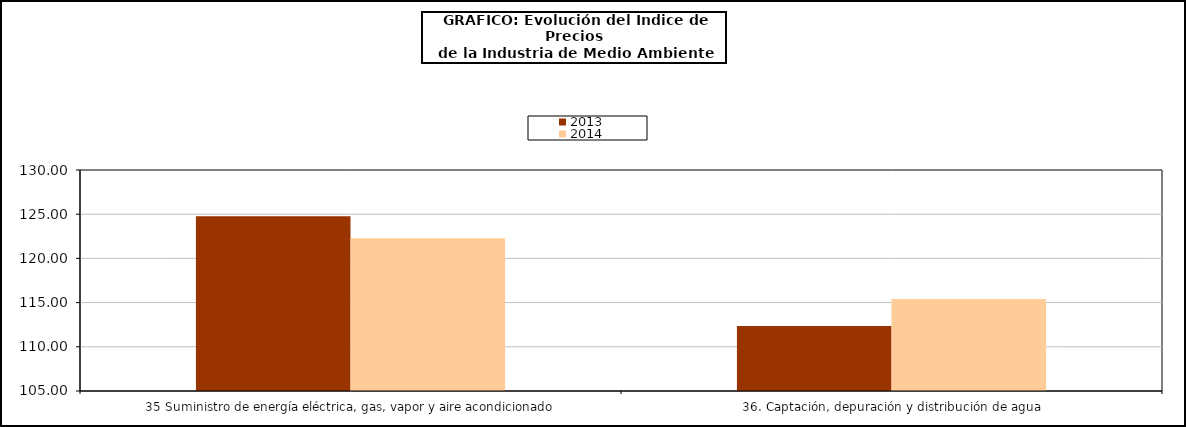
| Category | 2013 | 2014 |
|---|---|---|
| 35 Suministro de energía eléctrica, gas, vapor y aire acondicionado | 124.771 | 122.267 |
| 36. Captación, depuración y distribución de agua | 112.346 | 115.395 |